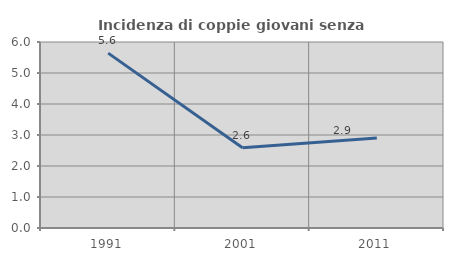
| Category | Incidenza di coppie giovani senza figli |
|---|---|
| 1991.0 | 5.641 |
| 2001.0 | 2.591 |
| 2011.0 | 2.907 |